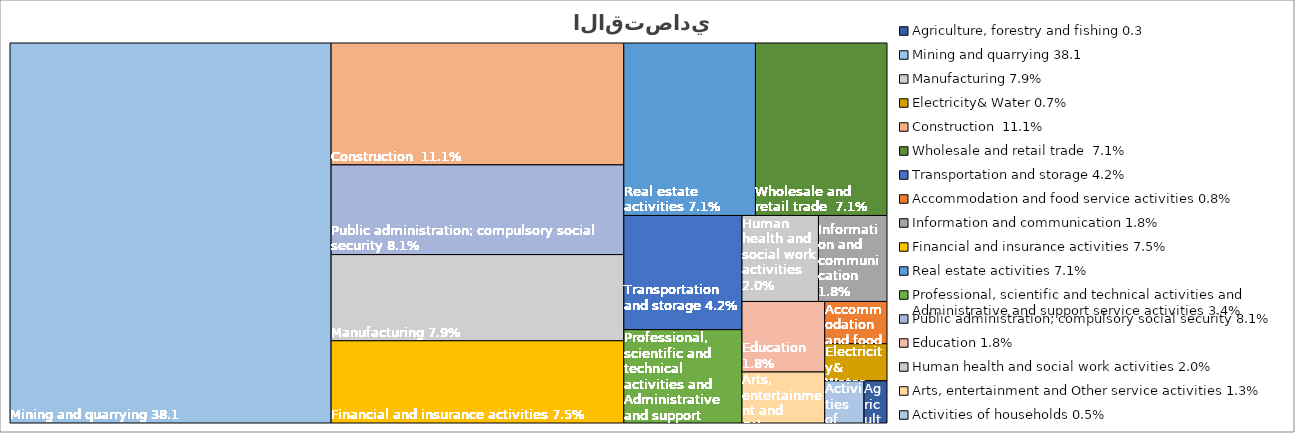
| Category | التعدين والمحاجر | غير التعدين والمحاجر |
|---|---|---|
| 2019Q1 | 64257.943 | 101849.24 |
| 2019Q2 | 63561.402 | 101463.551 |
| 2019Q3 | 65518.443 | 105892.021 |
| 2019Q4 | 62542.582 | 106846.953 |
| 2020Q1 | 64320.963 | 101294.014 |
| 2020Q2 | 62733.036 | 92719.682 |
| 2020Q3 | 63151.036 | 100746.478 |
| 2020Q4 | 60455.968 | 102606.272 |
| 2021Q1 | 62865.616 | 99317.218 |
| 2021Q2 | 63146.084 | 98778.533 |
| 2021Q3 | 62684.76 | 105097.088 |
| 2021Q4 | 61253.478 | 105427.085 |
| 2022Q1* | 61856.089 | 103743.842 |
| 2022Q2* | 63883.502 | 104590.105 |
| 2022Q3* | 64369.866 | 110829.672 |
| 2022Q4* | 64179.829 | 112835.316 |
| 2023Q1* | 64369.48 | 104497.573 |